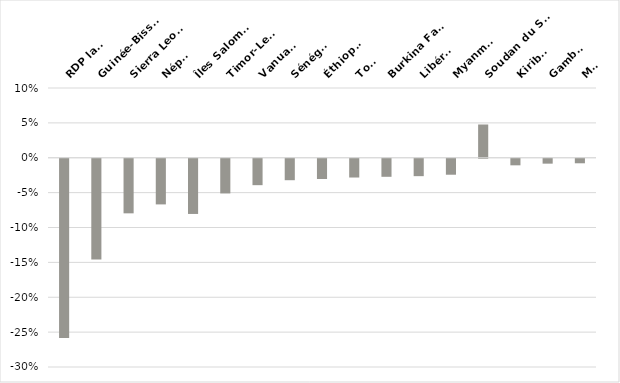
| Category | Series 0 |
|---|---|
| RDP lao* | -0.257 |
| Guinée-Bissau | -0.145 |
| Sierra Leone | -0.078 |
| Népal | -0.065 |
| Îles Salomon | -0.079 |
| Timor-Leste | -0.05 |
| Vanuatu | -0.038 |
| Sénégal | -0.031 |
| Éthiopie | -0.029 |
| Togo | -0.027 |
| Burkina Faso | -0.026 |
| Libéria | -0.025 |
| Myanmar | -0.023 |
| Soudan du Sud | 0.048 |
| Kiribati | -0.009 |
| Gambie | -0.007 |
| Mali | -0.007 |